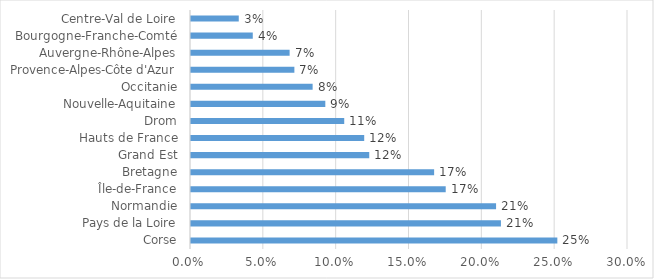
| Category | Prop2020 |
|---|---|
| Corse | 0.251 |
| Pays de la Loire | 0.213 |
| Normandie | 0.209 |
| Île-de-France | 0.175 |
| Bretagne | 0.167 |
| Grand Est | 0.122 |
| Hauts de France | 0.119 |
| Drom | 0.105 |
| Nouvelle-Aquitaine | 0.092 |
| Occitanie | 0.084 |
| Provence-Alpes-Côte d'Azur | 0.071 |
| Auvergne-Rhône-Alpes | 0.068 |
| Bourgogne-Franche-Comté | 0.042 |
| Centre-Val de Loire | 0.033 |